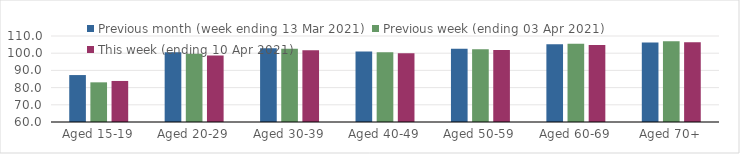
| Category | Previous month (week ending 13 Mar 2021) | Previous week (ending 03 Apr 2021) | This week (ending 10 Apr 2021) |
|---|---|---|---|
| Aged 15-19 | 87.29 | 83.06 | 83.86 |
| Aged 20-29 | 100.51 | 99.65 | 98.67 |
| Aged 30-39 | 102.81 | 102.57 | 101.7 |
| Aged 40-49 | 100.95 | 100.49 | 99.98 |
| Aged 50-59 | 102.6 | 102.24 | 101.9 |
| Aged 60-69 | 105.26 | 105.46 | 104.79 |
| Aged 70+ | 106.18 | 106.91 | 106.4 |